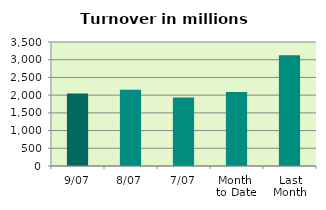
| Category | Series 0 |
|---|---|
| 9/07 | 2042.845 |
| 8/07 | 2150.32 |
| 7/07 | 1935.025 |
| Month 
to Date | 2092.031 |
| Last
Month | 3125.17 |